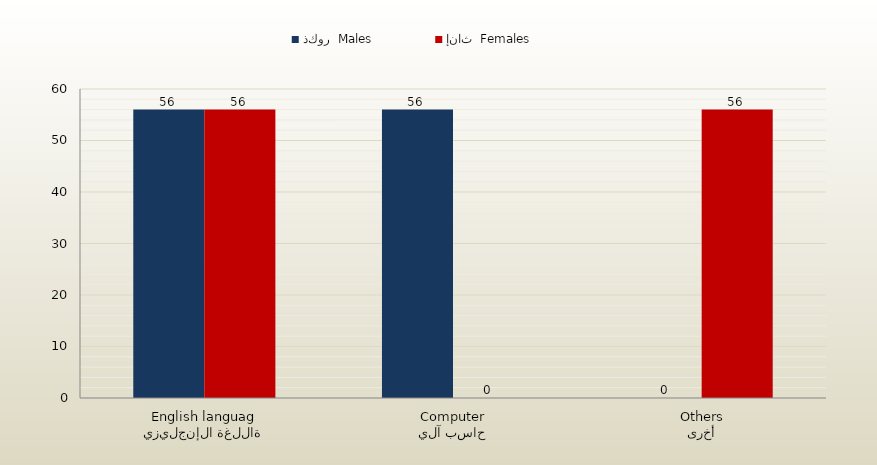
| Category | ذكور  Males | إناث  Females |
|---|---|---|
| اللغة الإنجليزية
English language | 56 | 56 |
| حاسب آلي
Computer | 56 | 0 |
| أخرى
Others | 0 | 56 |